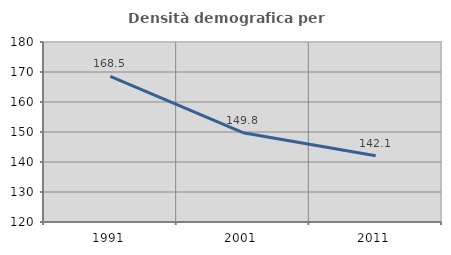
| Category | Densità demografica |
|---|---|
| 1991.0 | 168.524 |
| 2001.0 | 149.768 |
| 2011.0 | 142.062 |